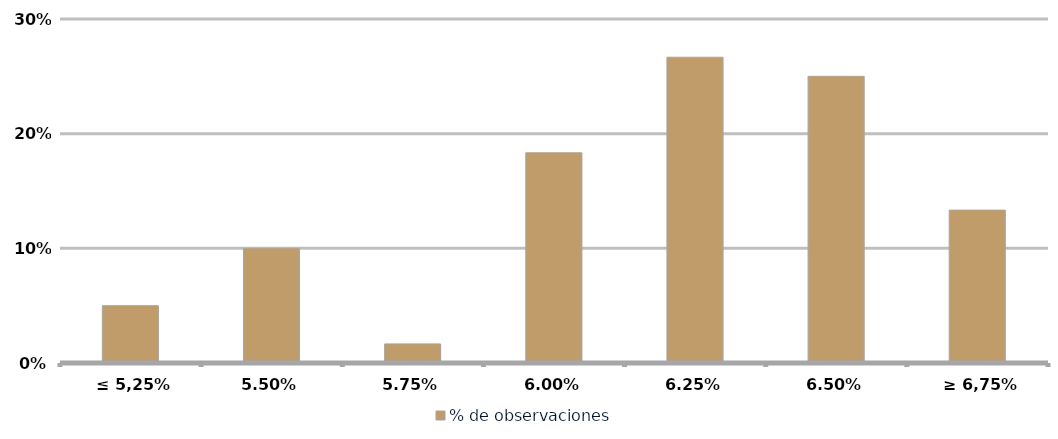
| Category | % de observaciones  |
|---|---|
|  ≤ 5,25% | 0.05 |
| 5.50% | 0.1 |
| 5.75% | 0.017 |
| 6.00% | 0.183 |
| 6.25% | 0.267 |
| 6.50% | 0.25 |
|  ≥ 6,75% | 0.133 |